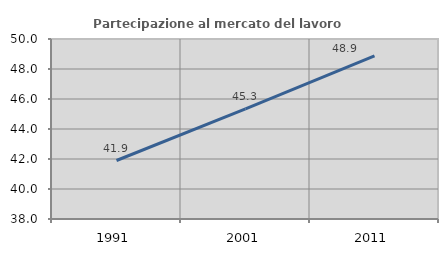
| Category | Partecipazione al mercato del lavoro  femminile |
|---|---|
| 1991.0 | 41.9 |
| 2001.0 | 45.348 |
| 2011.0 | 48.876 |